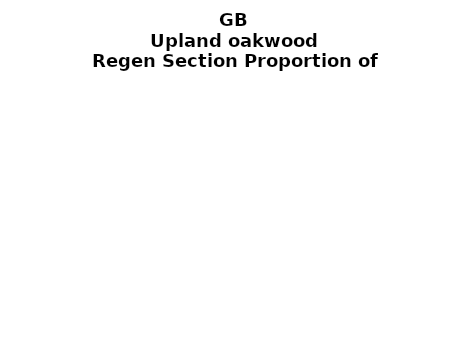
| Category | Upland oakwood |
|---|---|
| None | 0.127 |
| Seedlings only | 0 |
| Seedlings, saplings only | 0.07 |
| Seedlings, saplings, <7 cm trees | 0.125 |
| Saplings only | 0.258 |
| <7 cm trees, seedlings only | 0 |
| <7 cm trees, saplings only | 0.315 |
| <7 cm Trees only | 0.105 |